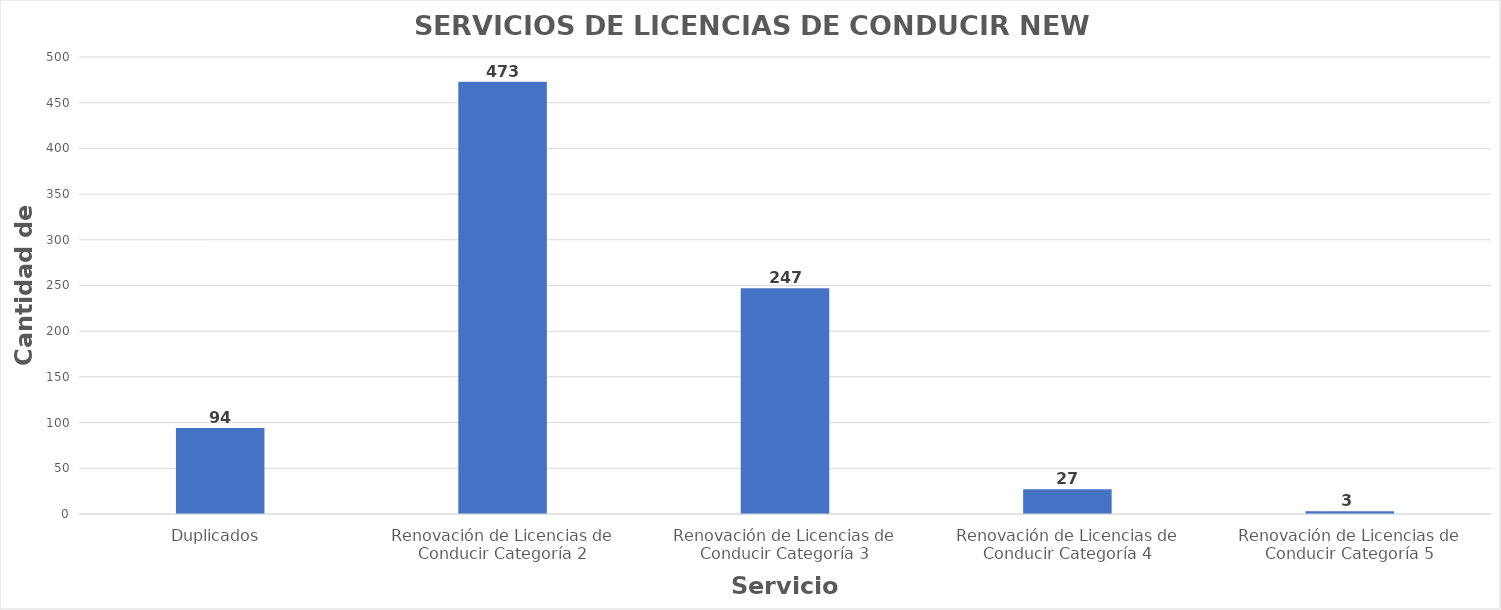
| Category | Series 0 |
|---|---|
| Duplicados  | 94 |
| Renovación de Licencias de Conducir Categoría 2 | 473 |
| Renovación de Licencias de Conducir Categoría 3 | 247 |
| Renovación de Licencias de Conducir Categoría 4 | 27 |
| Renovación de Licencias de Conducir Categoría 5 | 3 |